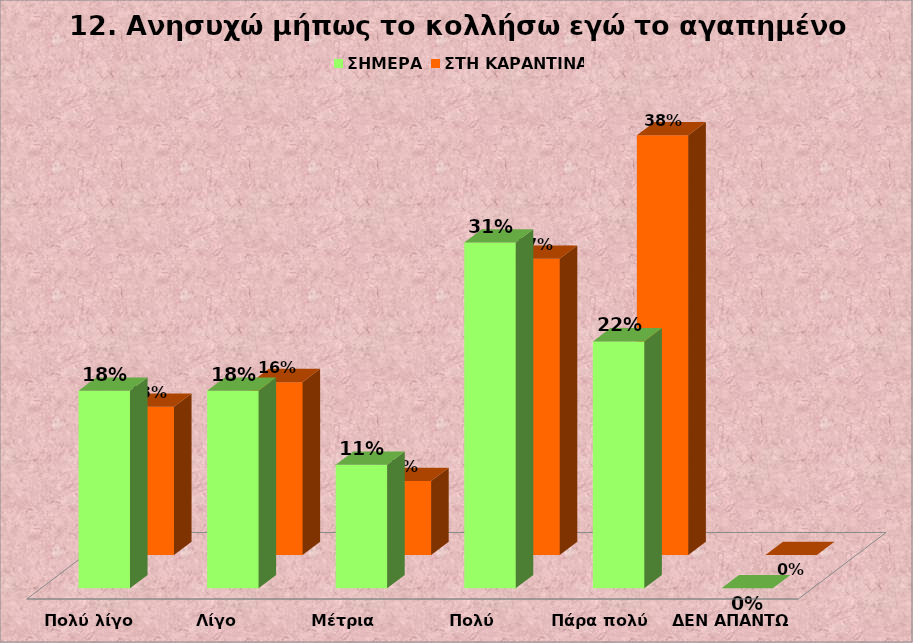
| Category | Series 0 | ΣΗΜΕΡΑ  | ΣΤΗ ΚΑΡΑΝΤΙΝΑ |
|---|---|---|---|
| Πολύ λίγο |  | 0.178 | 0.133 |
| Λίγο |  | 0.178 | 0.156 |
| Μέτρια  |  | 0.111 | 0.067 |
| Πολύ  |  | 0.311 | 0.267 |
| Πάρα πολύ  |  | 0.222 | 0.378 |
| ΔΕΝ ΑΠΑΝΤΩ |  | 0 | 0 |